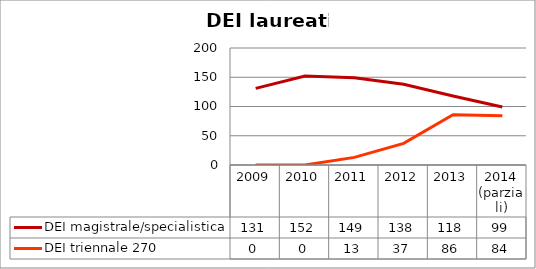
| Category | DEI magistrale/specialistica | DEI triennale 270 |
|---|---|---|
| 2009 | 131 | 0 |
| 2010 | 152 | 0 |
| 2011 | 149 | 13 |
| 2012 | 138 | 37 |
| 2013 | 118 | 86 |
| 2014
(parziali) | 99 | 84 |